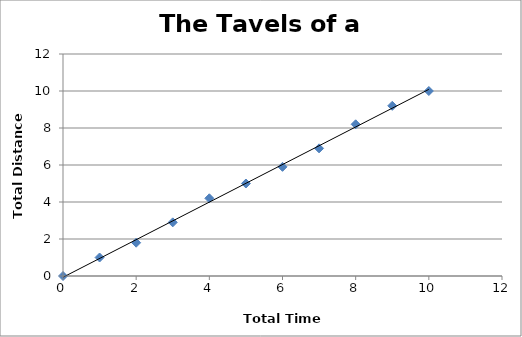
| Category | Distance (km) |
|---|---|
| 0.0 | 0 |
| 1.0 | 1 |
| 2.0 | 1.8 |
| 3.0 | 2.9 |
| 4.0 | 4.2 |
| 5.0 | 5 |
| 6.0 | 5.9 |
| 7.0 | 6.9 |
| 8.0 | 8.2 |
| 9.0 | 9.2 |
| 10.0 | 10 |